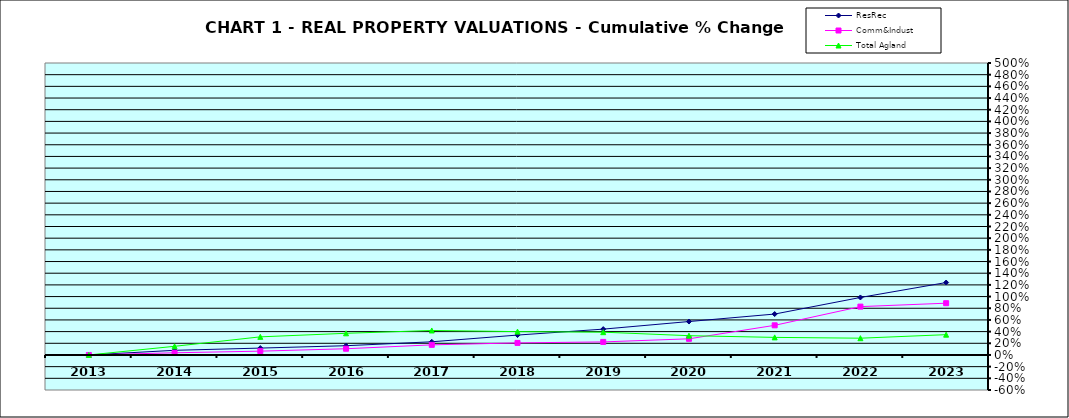
| Category | ResRec | Comm&Indust | Total Agland |
|---|---|---|---|
| 2013.0 | 0 | 0 | 0 |
| 2014.0 | 0.08 | 0.037 | 0.148 |
| 2015.0 | 0.118 | 0.065 | 0.31 |
| 2016.0 | 0.158 | 0.107 | 0.371 |
| 2017.0 | 0.226 | 0.173 | 0.419 |
| 2018.0 | 0.341 | 0.207 | 0.4 |
| 2019.0 | 0.442 | 0.224 | 0.39 |
| 2020.0 | 0.572 | 0.277 | 0.33 |
| 2021.0 | 0.701 | 0.508 | 0.301 |
| 2022.0 | 0.985 | 0.828 | 0.287 |
| 2023.0 | 1.24 | 0.886 | 0.348 |